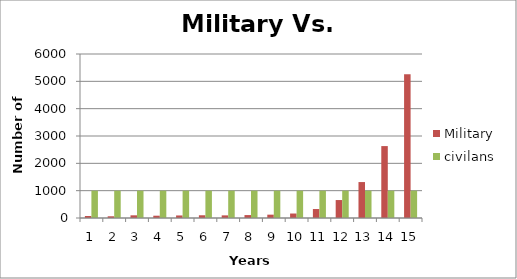
| Category | Military  | civilans  |
|---|---|---|
| 0 | 73 | 1000 |
| 1 | 63 | 1000 |
| 2 | 98 | 1000 |
| 3 | 84 | 1000 |
| 4 | 93 | 1000 |
| 5 | 100 | 1000 |
| 6 | 96 | 1000 |
| 7 | 107 | 1000 |
| 8 | 122 | 1000 |
| 9 | 164 | 1000 |
| 10 | 328 | 1000 |
| 11 | 657 | 1000 |
| 12 | 1315 | 1000 |
| 13 | 2631 | 1000 |
| 14 | 5262 | 1000 |